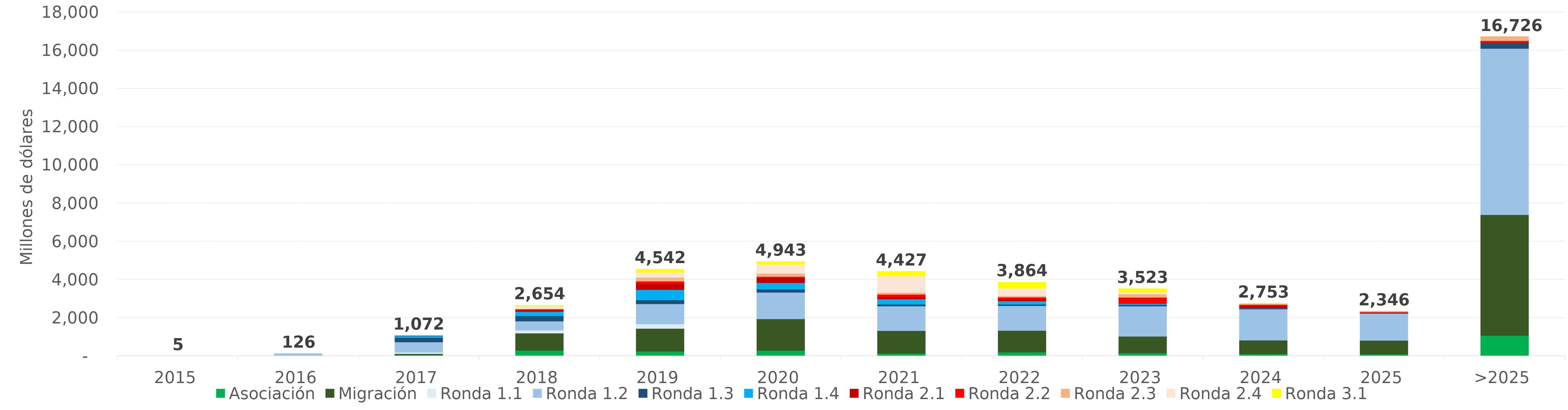
| Category | Asociación | Migración | Ronda 1.1 | Ronda 1.2 | Ronda 1.3 | Ronda 1.4 | Ronda 2.1 | Ronda 2.2 | Ronda 2.3 | Ronda 2.4 | Ronda 3.1 |
|---|---|---|---|---|---|---|---|---|---|---|---|
| 2015 | 0 | 0 | 4.573 | 0.236 | 0 | 0 | 0 | 0 | 0 | 0 | 0 |
| 2016 | 0 | 0 | 16.79 | 108.909 | 0 | 0 | 0 | 0 | 0 | 0 | 0 |
| 2017 | 50.877 | 65.422 | 76.429 | 533.486 | 231.789 | 93.443 | 18.851 | 1.29 | 0.72 | 0 | 0 |
| 2018 | 289.394 | 902.921 | 155.042 | 470.128 | 278.302 | 226.903 | 104.896 | 21.902 | 26.974 | 139.641 | 37.691 |
| 2019 | 241.207 | 1195.818 | 236.68 | 1049.68 | 207.126 | 540.649 | 302.09 | 133.009 | 199.161 | 270.262 | 166.186 |
| 2020 | 284.321 | 1655.641 | 6.736 | 1382.287 | 161.213 | 341.057 | 252.645 | 70.216 | 163.112 | 477.469 | 148.013 |
| 2021 | 127.797 | 1192.243 | 2.229 | 1284.713 | 97.796 | 274.593 | 106.762 | 133.184 | 98.223 | 870.647 | 238.989 |
| 2022 | 194.279 | 1133.929 | 0 | 1296.527 | 77.18 | 171.379 | 108.625 | 90.894 | 70.555 | 397.454 | 323.017 |
| 2023 | 149.166 | 876.4 | 0 | 1577.797 | 82.915 | 59.302 | 27.746 | 292.274 | 167.685 | 104.985 | 184.454 |
| 2024 | 102.681 | 719.78 | 0 | 1631.366 | 57.216 | 10.68 | 91.044 | 70.674 | 65.551 | 1.529 | 2.805 |
| 2025 | 89.748 | 719.885 | 0 | 1409.554 | 37.877 | 5.238 | 2.607 | 36.334 | 44.551 | 0 | 0 |
| >2025 | 1066.13 | 6325.095 | 0 | 8701.578 | 310.453 | 0 | 0 | 95.608 | 226.914 | 0 | 0 |